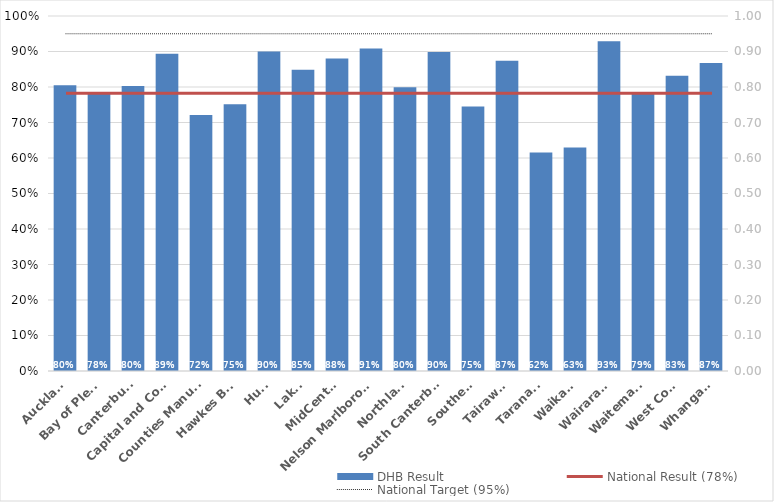
| Category | DHB Result |
|---|---|
| Auckland | 0.805 |
| Bay of Plenty | 0.78 |
| Canterbury | 0.803 |
| Capital and Coast | 0.894 |
| Counties Manukau | 0.721 |
| Hawkes Bay | 0.751 |
| Hutt | 0.9 |
| Lakes | 0.848 |
| MidCentral | 0.88 |
| Nelson Marlborough | 0.909 |
| Northland | 0.799 |
| South Canterbury | 0.898 |
| Southern | 0.745 |
| Tairawhiti | 0.874 |
| Taranaki | 0.615 |
| Waikato | 0.63 |
| Wairarapa | 0.929 |
| Waitemata | 0.786 |
| West Coast | 0.832 |
| Whanganui | 0.867 |